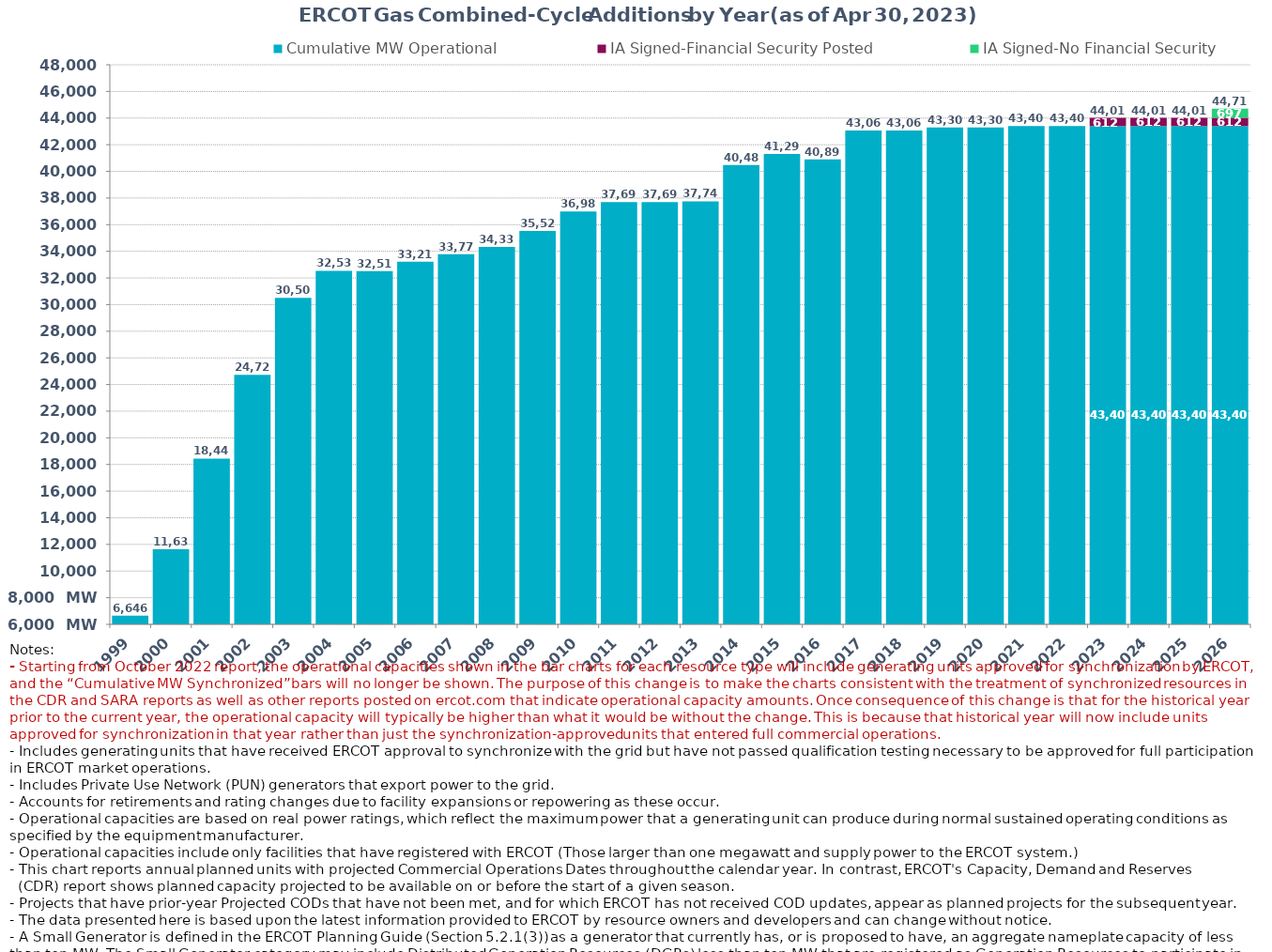
| Category | Cumulative MW Operational  | IA Signed-Financial Security Posted  | IA Signed-No Financial Security  | Small Generator | Cumulative Installed and Planned |
|---|---|---|---|---|---|
| 1999.0 | 6646.189 | 0 | 0 | 0 | 6646.189 |
| 2000.0 | 11630.519 | 0 | 0 | 0 | 11630.519 |
| 2001.0 | 18443.659 | 0 | 0 | 0 | 18443.659 |
| 2002.0 | 24721.899 | 0 | 0 | 0 | 24721.899 |
| 2003.0 | 30504.999 | 0 | 0 | 0 | 30504.999 |
| 2004.0 | 32535.519 | 0 | 0 | 0 | 32535.519 |
| 2005.0 | 32514.619 | 0 | 0 | 0 | 32514.619 |
| 2006.0 | 33218.819 | 0 | 0 | 0 | 33218.819 |
| 2007.0 | 33776.119 | 0 | 0 | 0 | 33776.119 |
| 2008.0 | 34337.219 | 0 | 0 | 0 | 34337.219 |
| 2009.0 | 35520.599 | 0 | 0 | 0 | 35520.599 |
| 2010.0 | 36980.799 | 0 | 0 | 0 | 36980.799 |
| 2011.0 | 37699.199 | 0 | 0 | 0 | 37699.199 |
| 2012.0 | 37699.199 | 0 | 0 | 0 | 37699.199 |
| 2013.0 | 37749.199 | 0 | 0 | 0 | 37749.199 |
| 2014.0 | 40480.999 | 0 | 0 | 0 | 40480.999 |
| 2015.0 | 41298.099 | 0 | 0 | 0 | 41298.099 |
| 2016.0 | 40899.109 | 0 | 0 | 0 | 40899.109 |
| 2017.0 | 43063.379 | 0 | 0 | 0 | 43063.379 |
| 2018.0 | 43063.379 | 0 | 0 | 0 | 43063.379 |
| 2019.0 | 43303.779 | 0 | 0 | 0 | 43303.779 |
| 2020.0 | 43303.779 | 0 | 0 | 0 | 43303.779 |
| 2021.0 | 43402.679 | 0 | 0 | 0 | 43402.679 |
| 2022.0 | 43402.679 | 0 | 0 | 0 | 43402.679 |
| 2023.0 | 43403.979 | 612 | 0 | 0 | 44015.979 |
| 2024.0 | 43403.979 | 612 | 0 | 0 | 44015.979 |
| 2025.0 | 43403.979 | 612 | 0 | 0 | 44015.979 |
| 2026.0 | 43403.979 | 612 | 697 | 0 | 44712.979 |